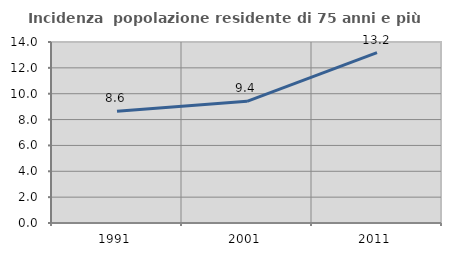
| Category | Incidenza  popolazione residente di 75 anni e più |
|---|---|
| 1991.0 | 8.642 |
| 2001.0 | 9.408 |
| 2011.0 | 13.18 |